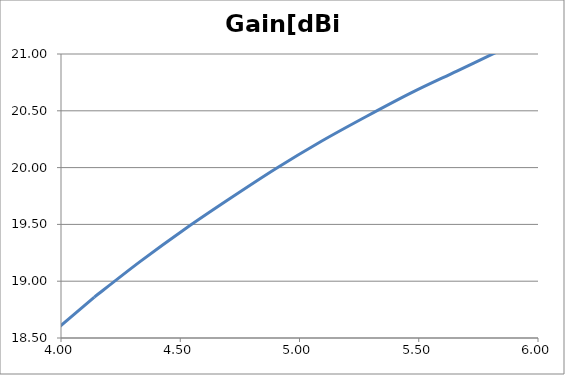
| Category | Gain[dBi] |
|---|---|
| 3.95 | 18.52 |
| 4.140000000000001 | 18.86 |
| 4.33 | 19.17 |
| 4.52 | 19.46 |
| 4.71 | 19.73 |
| 4.9 | 19.99 |
| 5.09 | 20.23 |
| 5.279999999999999 | 20.45 |
| 5.47 | 20.66 |
| 5.66 | 20.85 |
| 5.85 | 21.04 |